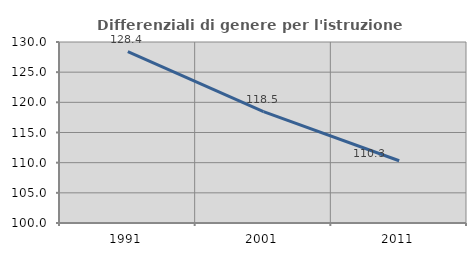
| Category | Differenziali di genere per l'istruzione superiore |
|---|---|
| 1991.0 | 128.41 |
| 2001.0 | 118.463 |
| 2011.0 | 110.32 |